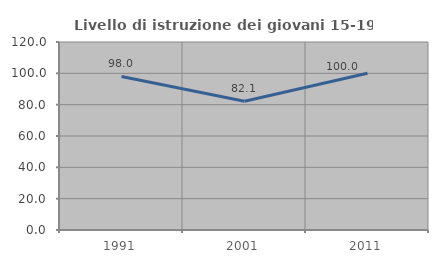
| Category | Livello di istruzione dei giovani 15-19 anni |
|---|---|
| 1991.0 | 98 |
| 2001.0 | 82.143 |
| 2011.0 | 100 |